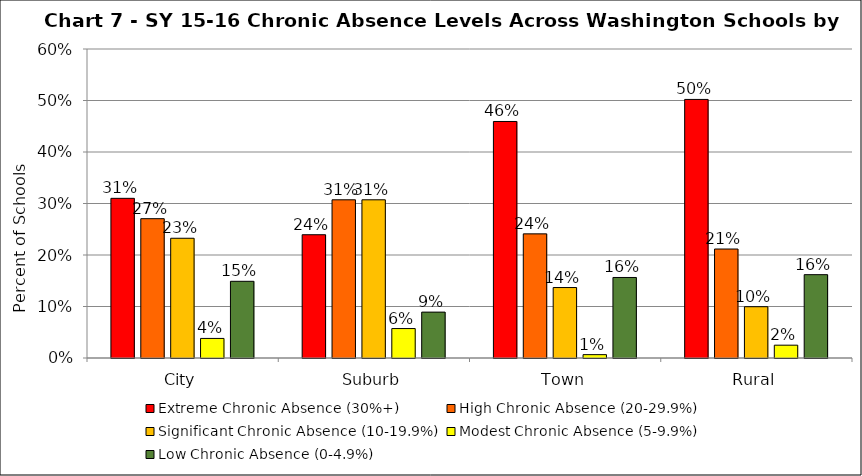
| Category | Extreme Chronic Absence (30%+) | High Chronic Absence (20-29.9%) | Significant Chronic Absence (10-19.9%) | Modest Chronic Absence (5-9.9%) | Low Chronic Absence (0-4.9%) |
|---|---|---|---|---|---|
| 0 | 0.31 | 0.271 | 0.233 | 0.038 | 0.149 |
| 1 | 0.239 | 0.307 | 0.307 | 0.057 | 0.089 |
| 2 | 0.459 | 0.241 | 0.137 | 0.007 | 0.156 |
| 3 | 0.502 | 0.212 | 0.1 | 0.025 | 0.162 |